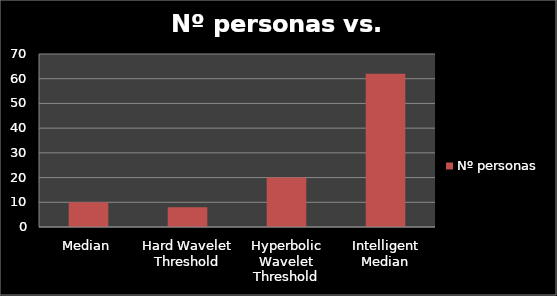
| Category | Nº personas |
|---|---|
| Median | 10 |
| Hard Wavelet Threshold | 8 |
| Hyperbolic Wavelet Threshold | 20 |
| Intelligent Median | 62 |